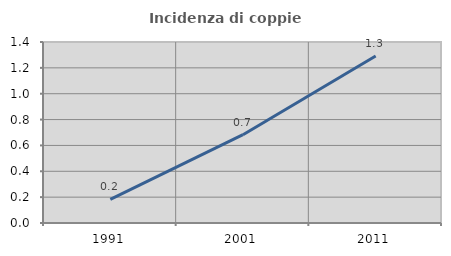
| Category | Incidenza di coppie miste |
|---|---|
| 1991.0 | 0.183 |
| 2001.0 | 0.683 |
| 2011.0 | 1.291 |